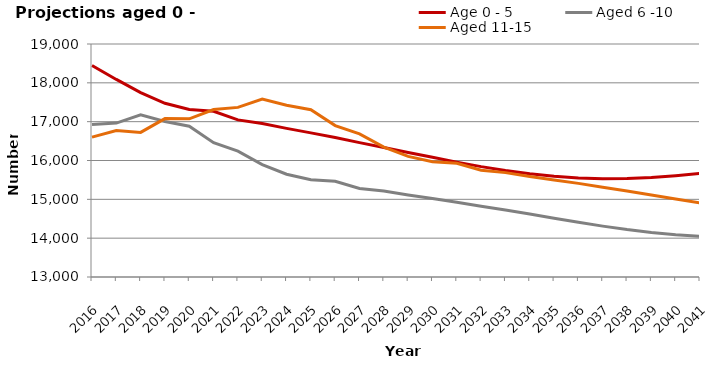
| Category | Age 0 - 5 | Aged 6 -10 | Aged 11-15 |
|---|---|---|---|
| 2016.0 | 18448 | 16930 | 16603 |
| 2017.0 | 18087.588 | 16964.209 | 16772.895 |
| 2018.0 | 17750.011 | 17174.941 | 16723.463 |
| 2019.0 | 17472.624 | 17004.447 | 17079.57 |
| 2020.0 | 17314.81 | 16883.702 | 17073.143 |
| 2021.0 | 17268.813 | 16457.256 | 17313.696 |
| 2022.0 | 17045.663 | 16239.913 | 17367.487 |
| 2023.0 | 16951.323 | 15893.392 | 17580.075 |
| 2024.0 | 16826.893 | 15647.269 | 17422.534 |
| 2025.0 | 16711.055 | 15503.712 | 17306.63 |
| 2026.0 | 16593.081 | 15464.049 | 16899.466 |
| 2027.0 | 16459.649 | 15279.959 | 16685.748 |
| 2028.0 | 16334.336 | 15213.336 | 16343.502 |
| 2029.0 | 16207.521 | 15112.695 | 16106.776 |
| 2030.0 | 16081.595 | 15019.844 | 15966.127 |
| 2031.0 | 15958.344 | 14927.386 | 15926.418 |
| 2032.0 | 15842.377 | 14823.06 | 15748.839 |
| 2033.0 | 15740.957 | 14724.618 | 15687.629 |
| 2034.0 | 15657.195 | 14621.218 | 15590.161 |
| 2035.0 | 15593.49 | 14515.519 | 15500.077 |
| 2036.0 | 15550.928 | 14410.656 | 15410.705 |
| 2037.0 | 15531.135 | 14310.268 | 15309.977 |
| 2038.0 | 15535.093 | 14220.836 | 15214.534 |
| 2039.0 | 15560.679 | 14146.148 | 15113.745 |
| 2040.0 | 15606.408 | 14087.885 | 15010.411 |
| 2041.0 | 15665.726 | 14048.249 | 14908.03 |